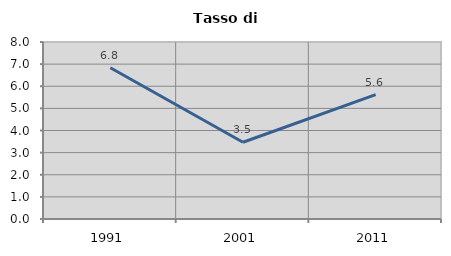
| Category | Tasso di disoccupazione   |
|---|---|
| 1991.0 | 6.839 |
| 2001.0 | 3.47 |
| 2011.0 | 5.623 |